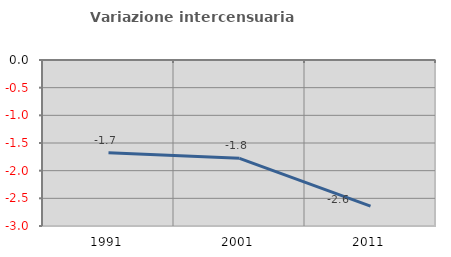
| Category | Variazione intercensuaria annua |
|---|---|
| 1991.0 | -1.678 |
| 2001.0 | -1.777 |
| 2011.0 | -2.641 |